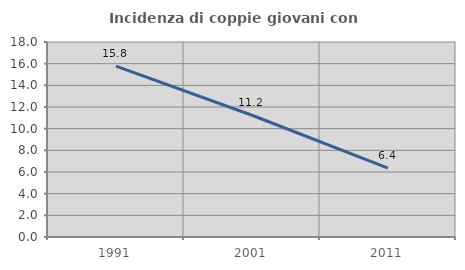
| Category | Incidenza di coppie giovani con figli |
|---|---|
| 1991.0 | 15.772 |
| 2001.0 | 11.239 |
| 2011.0 | 6.356 |